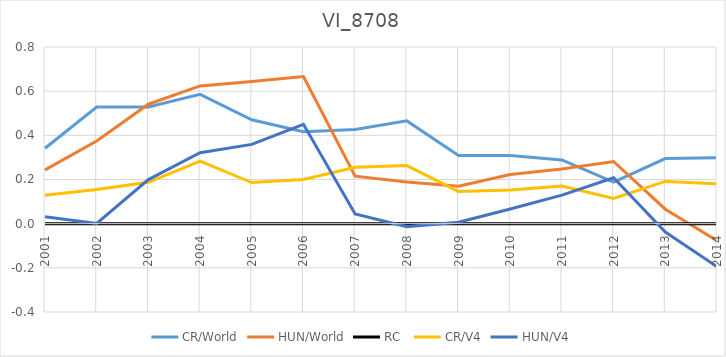
| Category | CR/World | HUN/World | RC  | CR/V4 | HUN/V4 |
|---|---|---|---|---|---|
| 2001.0 | 0.342 | 0.244 | 0 | 0.129 | 0.031 |
| 2002.0 | 0.528 | 0.374 | 0 | 0.155 | 0.001 |
| 2003.0 | 0.529 | 0.541 | 0 | 0.187 | 0.2 |
| 2004.0 | 0.586 | 0.624 | 0 | 0.284 | 0.321 |
| 2005.0 | 0.471 | 0.643 | 0 | 0.186 | 0.359 |
| 2006.0 | 0.416 | 0.666 | 0 | 0.2 | 0.45 |
| 2007.0 | 0.426 | 0.215 | 0 | 0.255 | 0.044 |
| 2008.0 | 0.465 | 0.189 | 0 | 0.263 | -0.014 |
| 2009.0 | 0.309 | 0.17 | 0 | 0.146 | 0.006 |
| 2010.0 | 0.309 | 0.223 | 0 | 0.153 | 0.066 |
| 2011.0 | 0.288 | 0.247 | 0 | 0.17 | 0.129 |
| 2012.0 | 0.188 | 0.281 | 0 | 0.114 | 0.208 |
| 2013.0 | 0.295 | 0.066 | 0 | 0.191 | -0.038 |
| 2014.0 | 0.299 | -0.077 | 0 | 0.181 | -0.195 |